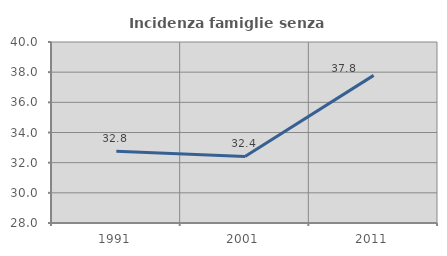
| Category | Incidenza famiglie senza nuclei |
|---|---|
| 1991.0 | 32.765 |
| 2001.0 | 32.414 |
| 2011.0 | 37.788 |